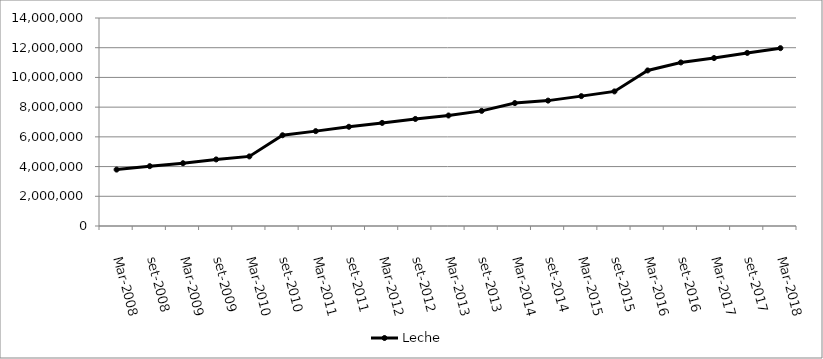
| Category | Leche  |
|---|---|
| mar-2008 | 3797111 |
| set-2008 | 4028016 |
| mar-2009 | 4225654 |
| set-2009 | 4481057 |
| mar-2010 | 4683949 |
| set-2010 | 6108066 |
| mar-2011 | 6385559 |
| set-2011 | 6678341 |
| mar-2012 | 6939046 |
| set-2012 | 7205573 |
| mar-2013 | 7437828 |
| set-2013 | 7748311 |
| mar-2014 | 8273856 |
| set-2014 | 8439417 |
| mar-2015 | 8741632 |
| set-2015 | 9059082 |
| mar-2016 | 10469600 |
| set-2016 | 11007373 |
| mar-2017 | 11304519 |
| set-2017 | 11650520 |
| mar-2018 | 11969882 |